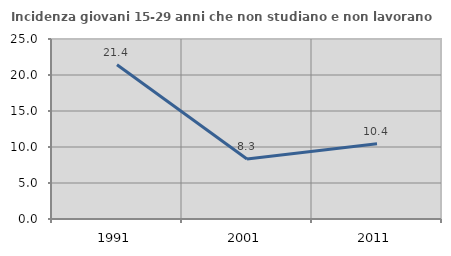
| Category | Incidenza giovani 15-29 anni che non studiano e non lavorano  |
|---|---|
| 1991.0 | 21.429 |
| 2001.0 | 8.333 |
| 2011.0 | 10.448 |